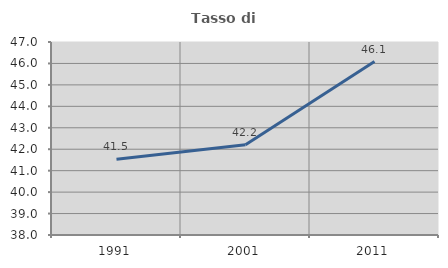
| Category | Tasso di occupazione   |
|---|---|
| 1991.0 | 41.529 |
| 2001.0 | 42.209 |
| 2011.0 | 46.091 |